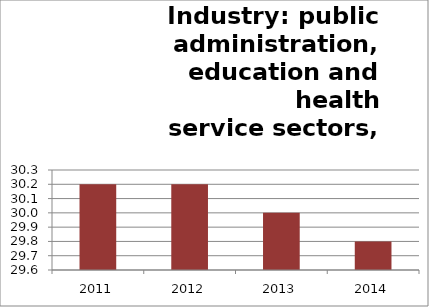
| Category | O-Q: Public admin., education & health  |
|---|---|
| 2011.0 | 30.2 |
| 2012.0 | 30.2 |
| 2013.0 | 30 |
| 2014.0 | 29.8 |